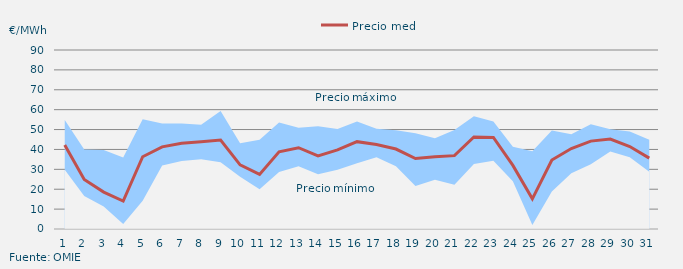
| Category | Precio medio |
|---|---|
| 1 | 42.255 |
| 2 | 24.891 |
| 3 | 18.552 |
| 4 | 14.07 |
| 5 | 36.319 |
| 6 | 41.289 |
| 7 | 43.139 |
| 8 | 43.874 |
| 9 | 44.751 |
| 10 | 32.273 |
| 11 | 27.426 |
| 12 | 38.811 |
| 13 | 40.859 |
| 14 | 36.738 |
| 15 | 39.805 |
| 16 | 43.912 |
| 17 | 42.503 |
| 18 | 40.209 |
| 19 | 35.411 |
| 20 | 36.386 |
| 21 | 36.882 |
| 22 | 46.25 |
| 23 | 46.002 |
| 24 | 31.98 |
| 25 | 15.153 |
| 26 | 34.712 |
| 27 | 40.48 |
| 28 | 44.189 |
| 29 | 45.262 |
| 30 | 41.49 |
| 31 | 35.647 |